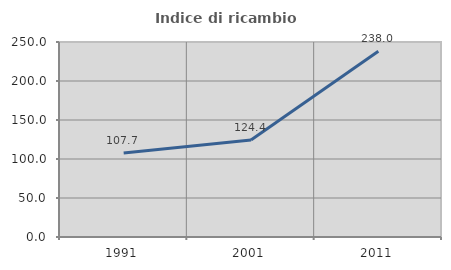
| Category | Indice di ricambio occupazionale  |
|---|---|
| 1991.0 | 107.667 |
| 2001.0 | 124.437 |
| 2011.0 | 238.034 |